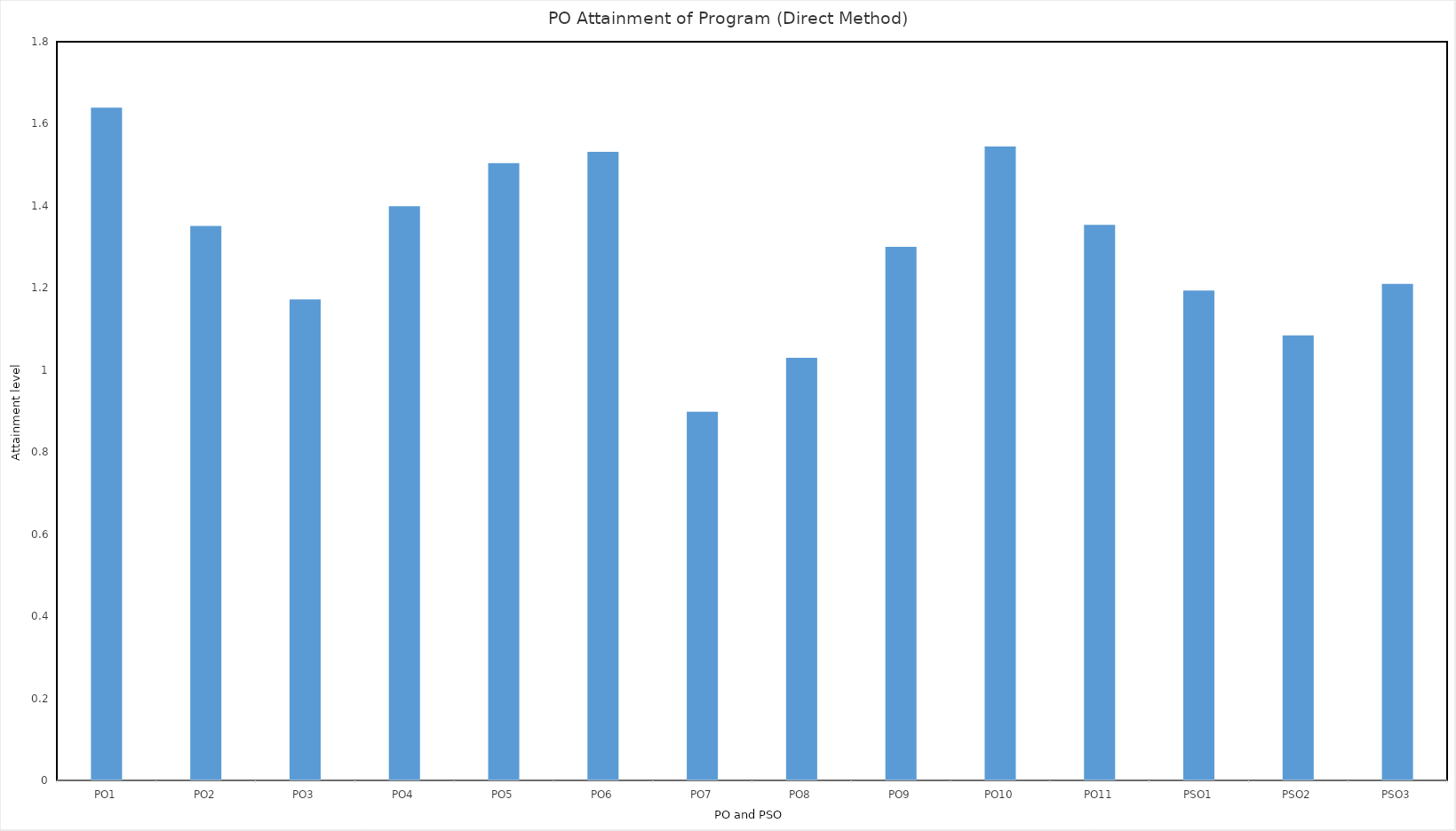
| Category | PO1 |
|---|---|
| PO1 | 1.639 |
| PO2 | 1.351 |
| PO3 | 1.172 |
| PO4 | 1.399 |
| PO5 | 1.504 |
| PO6 | 1.532 |
| PO7 | 0.898 |
| PO8 | 1.03 |
| PO9 | 1.3 |
| PO10 | 1.545 |
| PO11 | 1.354 |
| PSO1 | 1.194 |
| PSO2 | 1.085 |
| PSO3 | 1.21 |